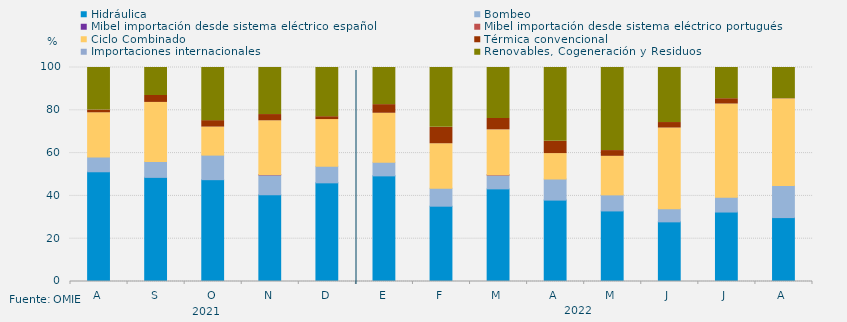
| Category | Hidráulica | Bombeo | Mibel importación desde sistema eléctrico español | Mibel importación desde sistema eléctrico portugués | Ciclo Combinado | Térmica convencional | Importaciones internacionales | Renovables, Cogeneración y Residuos |
|---|---|---|---|---|---|---|---|---|
| A | 51.277 | 6.922 | 0 | 0 | 20.632 | 1.279 | 0 | 19.919 |
| S | 48.657 | 7.384 | 0 | 0 | 27.639 | 3.245 | 0 | 13.097 |
| O | 47.584 | 11.477 | 0 | 0 | 13.093 | 3.021 | 0 | 24.843 |
| N | 40.532 | 9.282 | 0 | 0.139 | 25.139 | 2.917 | 0 | 21.991 |
| D | 46.102 | 7.728 | 0 | 0 | 21.841 | 1.344 | 0 | 22.984 |
| E | 49.362 | 6.328 | 0 | 0 | 22.928 | 4.032 | 0 | 17.35 |
| F | 35.193 | 8.333 | 0 | 0 | 20.833 | 7.664 | 0 | 27.976 |
| M | 43.282 | 6.472 | 0 | 0.135 | 20.962 | 5.328 | 0 | 23.822 |
| A | 38.032 | 9.861 | 0 | 0 | 11.875 | 5.741 | 0 | 34.491 |
| M | 32.975 | 7.504 | 0 | 0 | 18.011 | 2.688 | 0 | 38.822 |
| J | 27.87 | 6.134 | 0 | 0 | 37.708 | 2.569 | 0 | 25.718 |
| J | 32.46 | 6.855 | 0 | 0 | 43.616 | 2.487 | 0 | 14.583 |
| A | 29.861 | 14.964 | 0 | 0 | 40.479 | 0.134 | 0 | 14.561 |